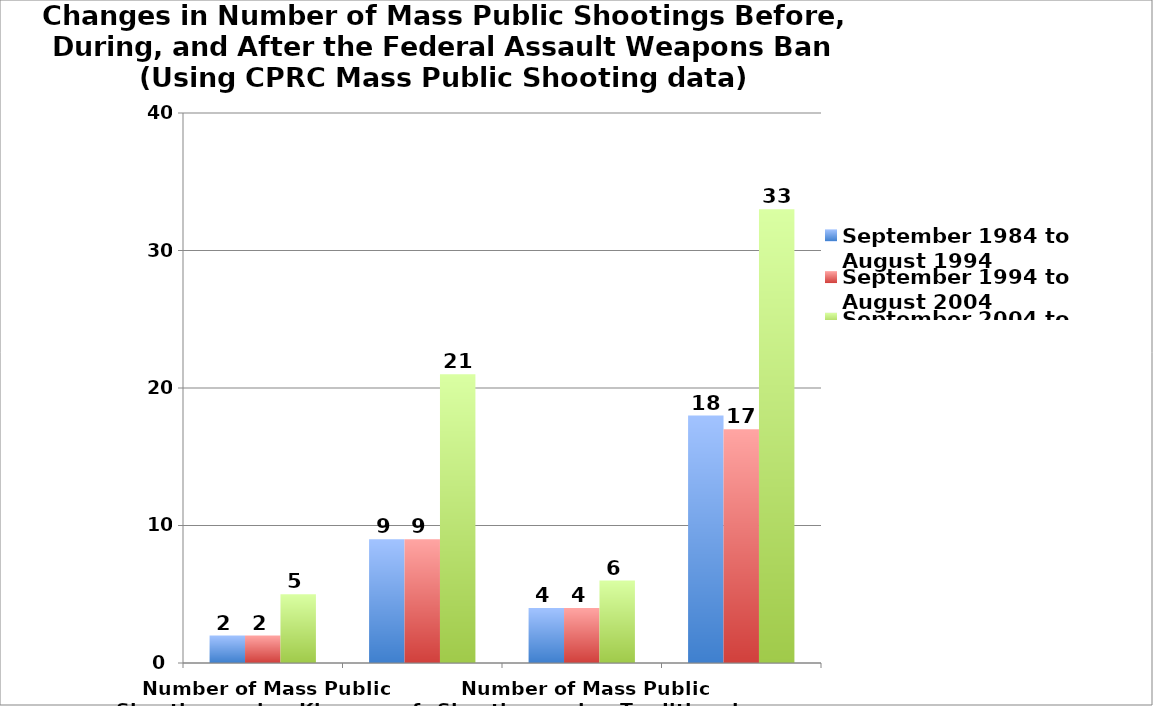
| Category | September 1984 to August 1994 | September 1994 to August 2004 | September 2004 to August 2014 |
|---|---|---|---|
| Number of Mass Public Shootings using Klaveras of 6 or more killed | 2 | 2 | 5 |
|  | 9 | 9 | 21 |
| Number of Mass Public Shootings using Traditional FBI Definition of 4 or more killed | 4 | 4 | 6 |
|  | 18 | 17 | 33 |